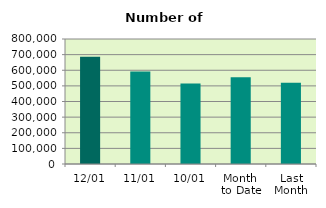
| Category | Series 0 |
|---|---|
| 12/01 | 686542 |
| 11/01 | 591230 |
| 10/01 | 515092 |
| Month 
to Date | 555222.889 |
| Last
Month | 519611.714 |